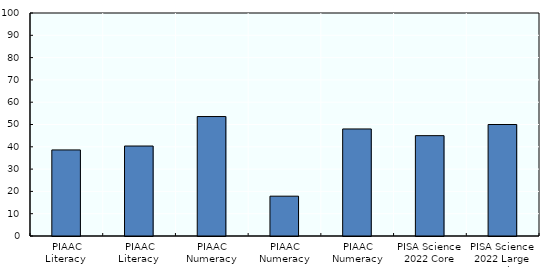
| Category | Share of uncertain questions |
|---|---|
| PIAAC Literacy 
2016 | 38.596 |
| PIAAC Literacy 
2021 | 40.351 |
| PIAAC Numeracy 2016 | 53.571 |
| PIAAC Numeracy 2021 | 17.857 |
| PIAAC Numeracy 2022 | 48 |
| PISA Science 2022 Core experts | 45 |
| PISA Science 2022 Large scale | 50 |